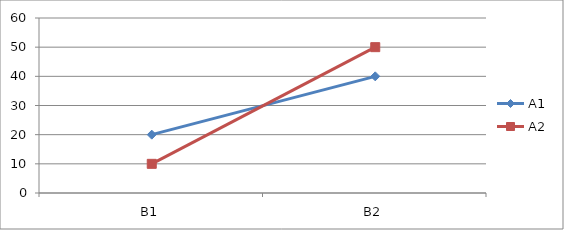
| Category | A1 | A2 |
|---|---|---|
| B1 | 20 | 10 |
| B2 | 40 | 50 |